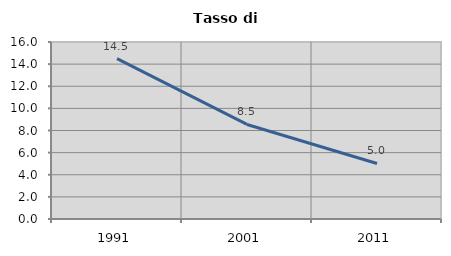
| Category | Tasso di disoccupazione   |
|---|---|
| 1991.0 | 14.496 |
| 2001.0 | 8.546 |
| 2011.0 | 5.019 |